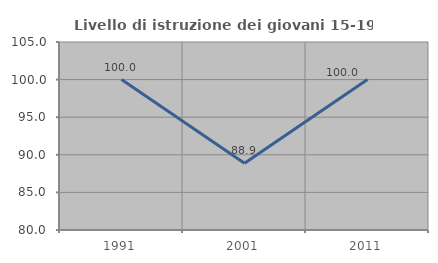
| Category | Livello di istruzione dei giovani 15-19 anni |
|---|---|
| 1991.0 | 100 |
| 2001.0 | 88.889 |
| 2011.0 | 100 |